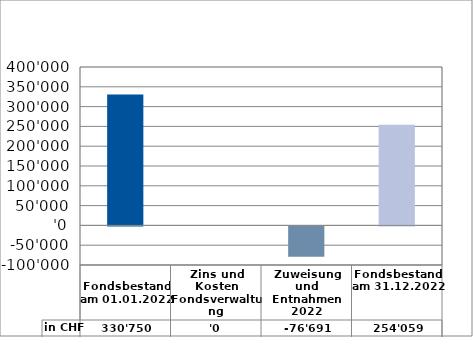
| Category | in CHF |
|---|---|
| 
Fondsbestand am 01.01.2022

 | 330750 |
| Zins und Kosten Fondsverwaltung | 0 |
| Zuweisung und Entnahmen 2022 | -76691 |
| Fondsbestand am 31.12.2022 | 254059 |